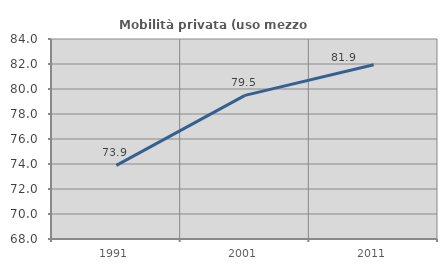
| Category | Mobilità privata (uso mezzo privato) |
|---|---|
| 1991.0 | 73.894 |
| 2001.0 | 79.49 |
| 2011.0 | 81.935 |